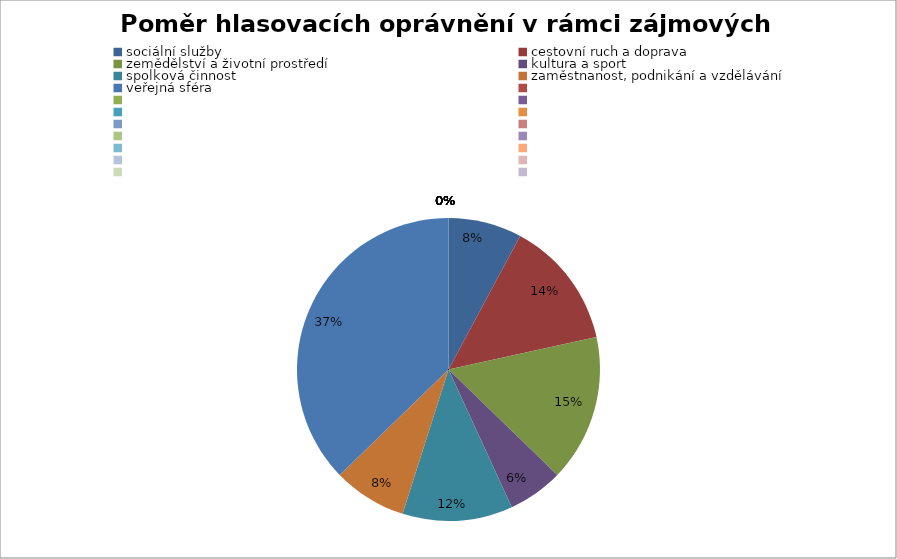
| Category | Series 0 |
|---|---|
| sociální služby | 0.078 |
| cestovní ruch a doprava | 0.137 |
| zemědělství a životní prostředí | 0.157 |
| kultura a sport | 0.059 |
| spolková činnost | 0.118 |
| zaměstnanost, podnikání a vzdělávání | 0.078 |
| veřejná sféra | 0.373 |